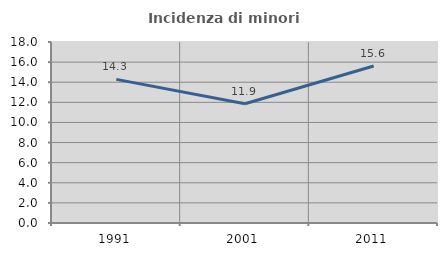
| Category | Incidenza di minori stranieri |
|---|---|
| 1991.0 | 14.286 |
| 2001.0 | 11.864 |
| 2011.0 | 15.607 |